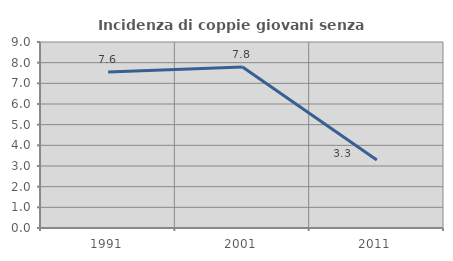
| Category | Incidenza di coppie giovani senza figli |
|---|---|
| 1991.0 | 7.552 |
| 2001.0 | 7.792 |
| 2011.0 | 3.285 |